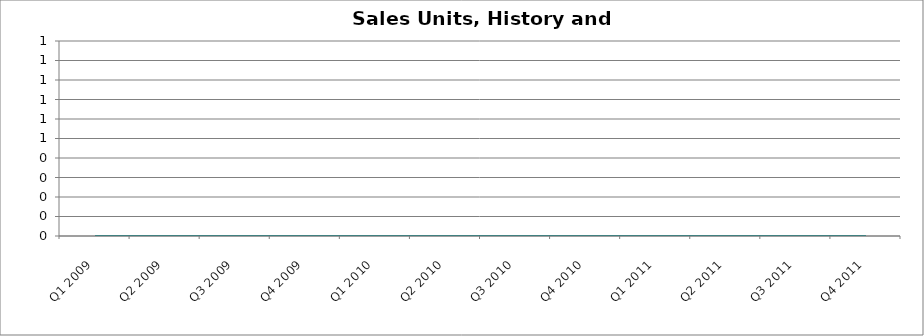
| Category | Sales Units |
|---|---|
| Q1 2009 | 0 |
| Q2 2009 | 0 |
| Q3 2009 | 0 |
| Q4 2009 | 0 |
| Q1 2010 | 0 |
| Q2 2010 | 0 |
| Q3 2010 | 0 |
| Q4 2010 | 0 |
| Q1 2011 | 0 |
| Q2 2011 | 0 |
| Q3 2011 | 0 |
| Q4 2011 | 0 |